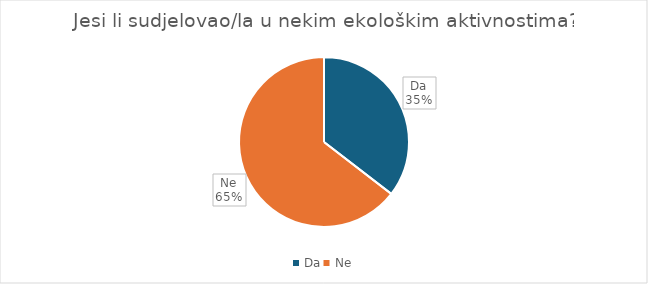
| Category | Series 0 |
|---|---|
| Da | 39 |
| Ne | 71 |